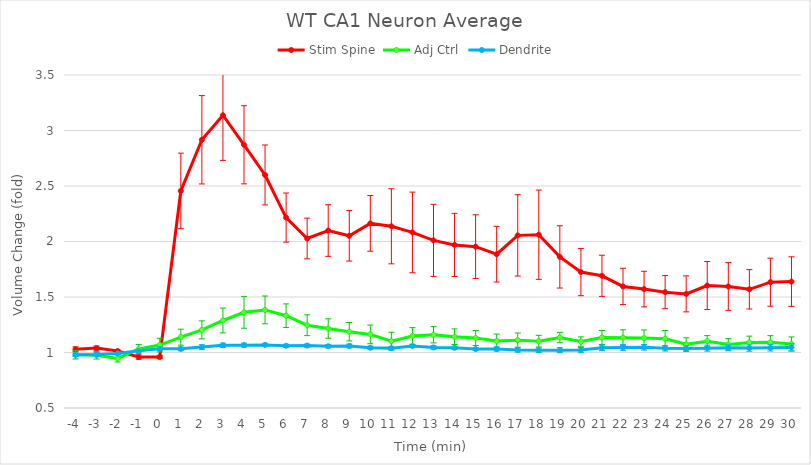
| Category | Stim Spine | Adj Ctrl | Dendrite |
|---|---|---|---|
| -4.0 | 1.029 | 0.98 | 0.98 |
| -3.0 | 1.04 | 0.975 | 0.982 |
| -2.0 | 1.013 | 0.946 | 0.991 |
| -1.0 | 0.959 | 1.032 | 1.015 |
| 0.0 | 0.959 | 1.067 | 1.033 |
| 1.0 | 2.455 | 1.138 | 1.033 |
| 2.0 | 2.916 | 1.204 | 1.049 |
| 3.0 | 3.138 | 1.288 | 1.065 |
| 4.0 | 2.871 | 1.362 | 1.066 |
| 5.0 | 2.599 | 1.384 | 1.068 |
| 6.0 | 2.216 | 1.332 | 1.06 |
| 7.0 | 2.027 | 1.246 | 1.062 |
| 8.0 | 2.099 | 1.216 | 1.057 |
| 9.0 | 2.051 | 1.187 | 1.059 |
| 10.0 | 2.163 | 1.163 | 1.043 |
| 11.0 | 2.137 | 1.102 | 1.039 |
| 12.0 | 2.082 | 1.149 | 1.058 |
| 13.0 | 2.01 | 1.16 | 1.045 |
| 14.0 | 1.969 | 1.142 | 1.042 |
| 15.0 | 1.954 | 1.131 | 1.031 |
| 16.0 | 1.886 | 1.104 | 1.031 |
| 17.0 | 2.055 | 1.111 | 1.023 |
| 18.0 | 2.061 | 1.102 | 1.021 |
| 19.0 | 1.861 | 1.135 | 1.021 |
| 20.0 | 1.725 | 1.098 | 1.022 |
| 21.0 | 1.691 | 1.135 | 1.042 |
| 22.0 | 1.595 | 1.132 | 1.045 |
| 23.0 | 1.571 | 1.13 | 1.047 |
| 24.0 | 1.544 | 1.124 | 1.038 |
| 25.0 | 1.528 | 1.074 | 1.035 |
| 26.0 | 1.603 | 1.102 | 1.039 |
| 27.0 | 1.595 | 1.073 | 1.042 |
| 28.0 | 1.569 | 1.091 | 1.04 |
| 29.0 | 1.633 | 1.092 | 1.043 |
| 30.0 | 1.639 | 1.077 | 1.046 |